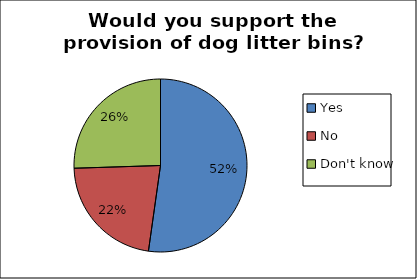
| Category | Series 0 |
|---|---|
| Yes | 0.522 |
| No | 0.223 |
| Don't know | 0.255 |